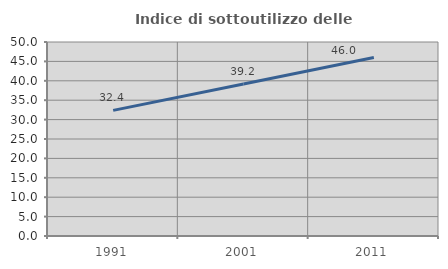
| Category | Indice di sottoutilizzo delle abitazioni  |
|---|---|
| 1991.0 | 32.375 |
| 2001.0 | 39.176 |
| 2011.0 | 46.029 |